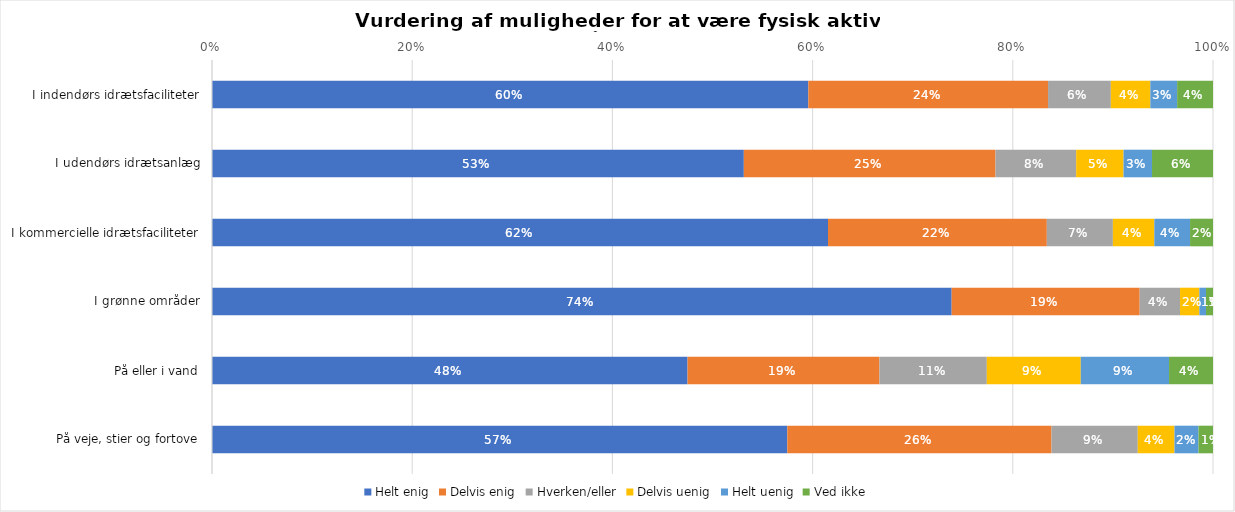
| Category | Helt enig | Delvis enig | Hverken/eller | Delvis uenig | Helt uenig | Ved ikke |
|---|---|---|---|---|---|---|
| I indendørs idrætsfaciliteter | 0.596 | 0.239 | 0.063 | 0.039 | 0.027 | 0.036 |
| I udendørs idrætsanlæg | 0.531 | 0.251 | 0.081 | 0.047 | 0.028 | 0.061 |
| I kommercielle idrætsfaciliteter | 0.615 | 0.219 | 0.066 | 0.041 | 0.036 | 0.023 |
| I grønne områder | 0.739 | 0.188 | 0.04 | 0.019 | 0.007 | 0.007 |
| På eller i vand | 0.475 | 0.192 | 0.107 | 0.094 | 0.088 | 0.044 |
| På veje, stier og fortove | 0.575 | 0.264 | 0.086 | 0.037 | 0.024 | 0.014 |